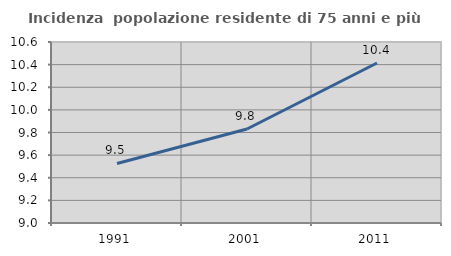
| Category | Incidenza  popolazione residente di 75 anni e più |
|---|---|
| 1991.0 | 9.526 |
| 2001.0 | 9.831 |
| 2011.0 | 10.414 |